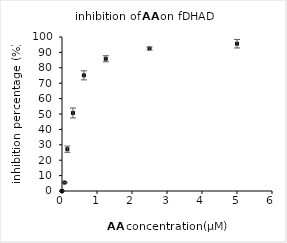
| Category | Series 0 |
|---|---|
| 5.0 | 95.65 |
| 2.5 | 92.55 |
| 1.25 | 85.86 |
| 0.625 | 75.1 |
| 0.3125 | 50.67 |
| 0.153125 | 27.14 |
| 0.076 | 5.48 |
| 0.0 | 0 |